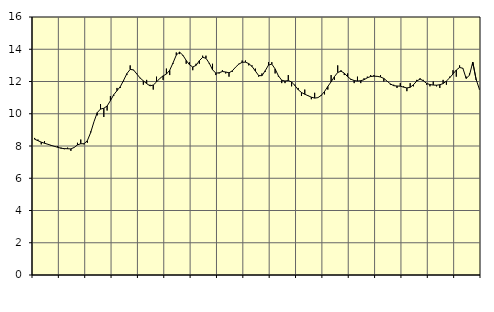
| Category | Piggar | Series 1 |
|---|---|---|
| nan | 8.5 | 8.42 |
| 87.0 | 8.4 | 8.33 |
| 87.0 | 8.1 | 8.24 |
| 87.0 | 8.3 | 8.17 |
| nan | 8.1 | 8.11 |
| 88.0 | 8 | 8.04 |
| 88.0 | 8 | 7.98 |
| 88.0 | 8 | 7.92 |
| nan | 7.9 | 7.86 |
| 89.0 | 7.8 | 7.84 |
| 89.0 | 7.9 | 7.83 |
| 89.0 | 7.7 | 7.82 |
| nan | 7.9 | 7.91 |
| 90.0 | 8.2 | 8.07 |
| 90.0 | 8.4 | 8.14 |
| 90.0 | 8.1 | 8.14 |
| nan | 8.2 | 8.33 |
| 91.0 | 8.9 | 8.83 |
| 91.0 | 9.5 | 9.5 |
| 91.0 | 9.9 | 10.07 |
| nan | 10.6 | 10.29 |
| 92.0 | 9.8 | 10.34 |
| 92.0 | 10.2 | 10.48 |
| 92.0 | 11.1 | 10.81 |
| nan | 11.1 | 11.18 |
| 93.0 | 11.6 | 11.43 |
| 93.0 | 11.6 | 11.68 |
| 93.0 | 12 | 12.07 |
| nan | 12.4 | 12.49 |
| 94.0 | 13 | 12.75 |
| 94.0 | 12.7 | 12.72 |
| 94.0 | 12.5 | 12.47 |
| nan | 12.2 | 12.22 |
| 95.0 | 11.8 | 12.04 |
| 95.0 | 12.1 | 11.87 |
| 95.0 | 11.8 | 11.73 |
| nan | 11.5 | 11.78 |
| 96.0 | 12.3 | 11.97 |
| 96.0 | 12.2 | 12.19 |
| 96.0 | 12.1 | 12.35 |
| nan | 12.8 | 12.46 |
| 97.0 | 12.4 | 12.7 |
| 97.0 | 13.1 | 13.15 |
| 97.0 | 13.8 | 13.64 |
| nan | 13.7 | 13.82 |
| 98.0 | 13.6 | 13.63 |
| 98.0 | 13.1 | 13.31 |
| 98.0 | 13.2 | 13.04 |
| nan | 12.7 | 12.9 |
| 99.0 | 13.1 | 13 |
| 99.0 | 13.1 | 13.29 |
| 99.0 | 13.6 | 13.5 |
| nan | 13.6 | 13.44 |
| 0.0 | 13.1 | 13.14 |
| 0.0 | 13.1 | 12.73 |
| 0.0 | 12.4 | 12.52 |
| nan | 12.5 | 12.54 |
| 1.0 | 12.7 | 12.62 |
| 1.0 | 12.5 | 12.59 |
| 1.0 | 12.3 | 12.54 |
| nan | 12.6 | 12.66 |
| 2.0 | 12.9 | 12.89 |
| 2.0 | 13.1 | 13.08 |
| 2.0 | 13.3 | 13.19 |
| nan | 13.3 | 13.2 |
| 3.0 | 13 | 13.11 |
| 3.0 | 13 | 12.93 |
| 3.0 | 12.8 | 12.65 |
| nan | 12.3 | 12.37 |
| 4.0 | 12.5 | 12.36 |
| 4.0 | 12.6 | 12.67 |
| 4.0 | 13.2 | 13.02 |
| nan | 13.2 | 13.08 |
| 5.0 | 12.5 | 12.78 |
| 5.0 | 12.3 | 12.35 |
| 5.0 | 11.9 | 12.08 |
| nan | 11.9 | 12.03 |
| 6.0 | 12.4 | 12.06 |
| 6.0 | 11.7 | 11.97 |
| 6.0 | 11.8 | 11.75 |
| nan | 11.6 | 11.49 |
| 7.0 | 11.1 | 11.32 |
| 7.0 | 11.5 | 11.21 |
| 7.0 | 11.1 | 11.12 |
| nan | 10.9 | 11.03 |
| 8.0 | 11.3 | 10.97 |
| 8.0 | 11 | 11 |
| 8.0 | 11.1 | 11.14 |
| nan | 11.2 | 11.38 |
| 9.0 | 11.5 | 11.69 |
| 9.0 | 12.4 | 11.98 |
| 9.0 | 12.1 | 12.3 |
| nan | 13 | 12.56 |
| 10.0 | 12.7 | 12.64 |
| 10.0 | 12.4 | 12.52 |
| 10.0 | 12.5 | 12.3 |
| nan | 12.1 | 12.14 |
| 11.0 | 11.9 | 12.06 |
| 11.0 | 12.3 | 12.03 |
| 11.0 | 11.9 | 12.05 |
| nan | 12.2 | 12.11 |
| 12.0 | 12.3 | 12.23 |
| 12.0 | 12.4 | 12.31 |
| 12.0 | 12.4 | 12.33 |
| nan | 12.3 | 12.32 |
| 13.0 | 12.4 | 12.28 |
| 13.0 | 12 | 12.19 |
| 13.0 | 12 | 12.02 |
| nan | 11.8 | 11.85 |
| 14.0 | 11.8 | 11.74 |
| 14.0 | 11.6 | 11.72 |
| 14.0 | 11.9 | 11.71 |
| nan | 11.7 | 11.65 |
| 15.0 | 11.4 | 11.6 |
| 15.0 | 11.9 | 11.64 |
| 15.0 | 11.7 | 11.8 |
| nan | 12.1 | 12.03 |
| 16.0 | 12.2 | 12.15 |
| 16.0 | 12.1 | 12.05 |
| 16.0 | 11.8 | 11.88 |
| nan | 11.7 | 11.81 |
| 17.0 | 12 | 11.78 |
| 17.0 | 11.7 | 11.77 |
| 17.0 | 11.6 | 11.8 |
| nan | 12.1 | 11.87 |
| 18.0 | 11.8 | 12.03 |
| 18.0 | 12.3 | 12.23 |
| 18.0 | 12.7 | 12.47 |
| nan | 12.3 | 12.71 |
| 19.0 | 13 | 12.87 |
| 19.0 | 12.8 | 12.82 |
| 19.0 | 12.3 | 12.19 |
| nan | 12.5 | 12.39 |
| 20.0 | 13 | 13.2 |
| 20.0 | 12.1 | 12.15 |
| 20.0 | 11.5 | 11.53 |